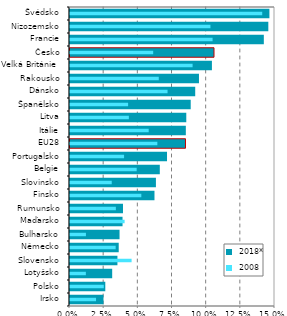
| Category |  2018* |
|---|---|
| Irsko | 0.025 |
| Polsko | 0.027 |
| Lotyšsko | 0.032 |
| Slovensko | 0.035 |
| Německo | 0.036 |
| Bulharsko | 0.037 |
| Maďarsko | 0.039 |
| Rumunsko | 0.04 |
| Finsko | 0.063 |
| Slovinsko | 0.064 |
| Belgie | 0.066 |
| Portugalsko | 0.072 |
| EU28 | 0.085 |
| Itálie | 0.085 |
| Litva | 0.086 |
| Španělsko | 0.089 |
| Dánsko | 0.092 |
| Rakousko | 0.095 |
| Velká Británie  | 0.105 |
| Česko | 0.106 |
| Francie | 0.143 |
| Nizozemsko | 0.146 |
| Švédsko | 0.147 |